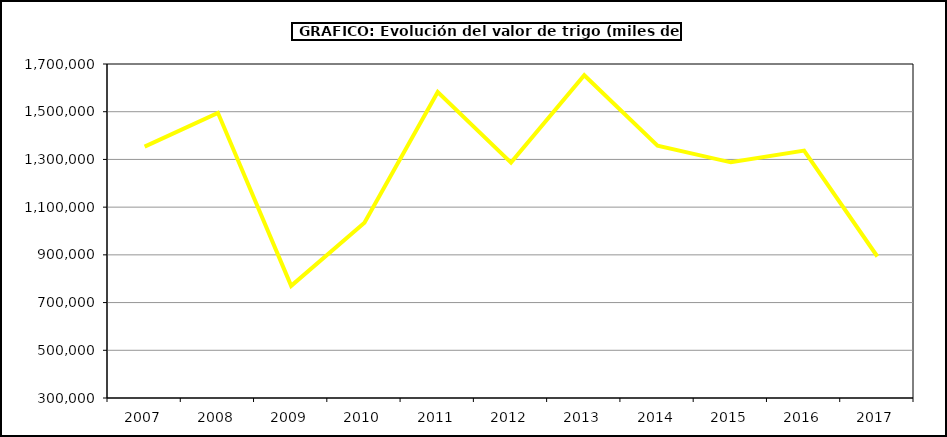
| Category | Valor |
|---|---|
| 2007.0 | 1353566.298 |
| 2008.0 | 1495406.813 |
| 2009.0 | 770204.952 |
| 2010.0 | 1034362.398 |
| 2011.0 | 1582317.395 |
| 2012.0 | 1286558.361 |
| 2013.0 | 1652767.635 |
| 2014.0 | 1357332.32 |
| 2015.0 | 1287809 |
| 2016.0 | 1336858 |
| 2017.0 | 893127.676 |